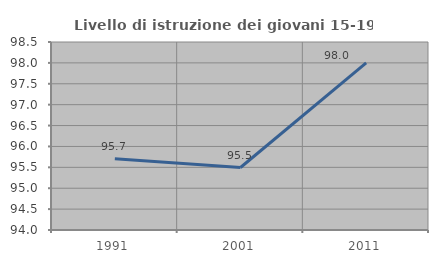
| Category | Livello di istruzione dei giovani 15-19 anni |
|---|---|
| 1991.0 | 95.706 |
| 2001.0 | 95.495 |
| 2011.0 | 98 |